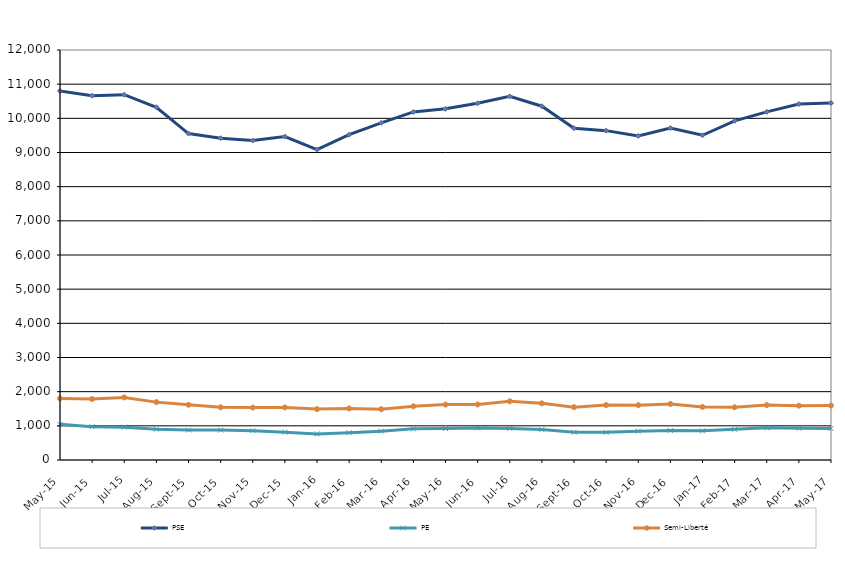
| Category | PSE | PE | Semi-Liberté |
|---|---|---|---|
| 2015-05-01 | 10801 | 1043 | 1803 |
| 2015-06-01 | 10662 | 973 | 1785 |
| 2015-07-01 | 10692 | 961 | 1832 |
| 2015-08-01 | 10325 | 903 | 1694 |
| 2015-09-01 | 9555 | 878 | 1616 |
| 2015-10-01 | 9420 | 877 | 1542 |
| 2015-11-01 | 9350 | 859 | 1533 |
| 2015-12-01 | 9466 | 815 | 1539 |
| 2016-01-01 | 9081 | 764 | 1490 |
| 2016-02-01 | 9521 | 798 | 1510 |
| 2016-03-01 | 9868 | 845 | 1486 |
| 2016-04-01 | 10187 | 912 | 1572 |
| 2016-05-01 | 10278 | 920 | 1621 |
| 2016-06-01 | 10441 | 939 | 1625 |
| 2016-07-01 | 10642 | 923 | 1718 |
| 2016-08-01 | 10355 | 890 | 1658 |
| 2016-09-01 | 9712 | 813 | 1546 |
| 2016-10-01 | 9640 | 809 | 1607 |
| 2016-11-01 | 9484 | 844 | 1605 |
| 2016-12-01 | 9714 | 866 | 1641 |
| 2017-01-01 | 9505 | 855 | 1553 |
| 2017-02-01 | 9927 | 900 | 1542 |
| 2017-03-01 | 10190 | 942 | 1607 |
| 2017-04-01 | 10417 | 931 | 1590 |
| 2017-05-01 | 10448 | 924 | 1594 |